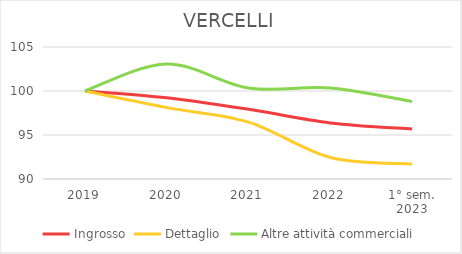
| Category | Ingrosso | Dettaglio | Altre attività commerciali |
|---|---|---|---|
| 2019 | 100 | 100 | 100 |
| 2020 | 99.228 | 98.112 | 103.072 |
| 2021 | 97.915 | 96.46 | 100.341 |
| 2022 | 96.371 | 92.448 | 100.341 |
| 1° sem.
2023 | 95.676 | 91.706 | 98.805 |